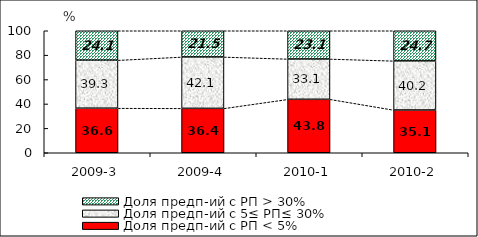
| Category | Доля предп-ий с РП < 5% | Доля предп-ий с 5≤ РП≤ 30% | Доля предп-ий с РП > 30% |
|---|---|---|---|
| 2009-3 | 36.551 | 39.334 | 24.115 |
| 2009-4 | 36.397 | 42.132 | 21.471 |
| 2010-1 | 43.821 | 33.055 | 23.124 |
| 2010-2 | 35.055 | 40.24 | 24.705 |